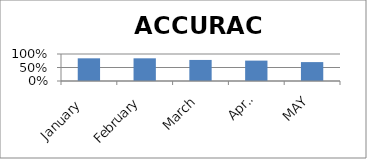
| Category | ACCURACY |
|---|---|
| January  | 0.84 |
| February | 0.84 |
| March | 0.78 |
| April | 0.755 |
| MAY | 0.7 |